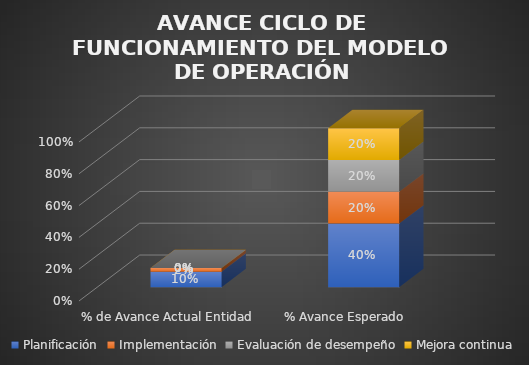
| Category | Planificación | Implementación | Evaluación de desempeño | Mejora continua |
|---|---|---|---|---|
| % de Avance Actual Entidad | 0.098 | 0.023 | 0 | 0 |
| % Avance Esperado | 0.4 | 0.2 | 0.2 | 0.2 |